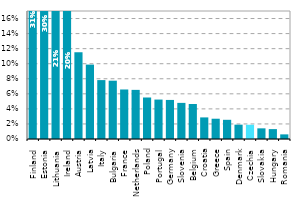
| Category | Series 0 |
|---|---|
| Finland | 0.313 |
| Estonia | 0.303 |
| Lithuania | 0.21 |
| Ireland | 0.205 |
| Austria | 0.115 |
| Latvia | 0.099 |
| Italy | 0.078 |
| Bulgaria | 0.077 |
| France | 0.066 |
| Netherlands | 0.065 |
| Poland | 0.055 |
| Portugal | 0.052 |
| Germany | 0.052 |
| Slovenia | 0.048 |
| Belgium | 0.046 |
| Croatia | 0.029 |
| Greece | 0.027 |
| Spain | 0.025 |
| Denmark | 0.019 |
| Czechia | 0.019 |
| Slovakia | 0.014 |
| Hungary | 0.013 |
| Romania | 0.006 |